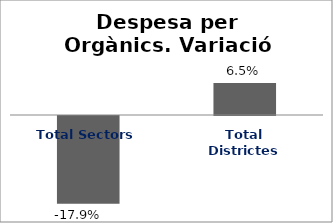
| Category | Series 0 |
|---|---|
| Total Sectors | -0.179 |
| Total Districtes | 0.065 |